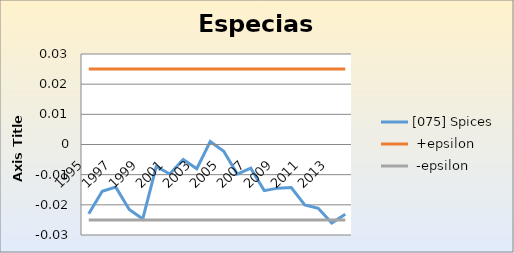
| Category | [075] Spices |  +epsilon |  -epsilon |
|---|---|---|---|
| 1995.0 | -0.023 | 0.025 | -0.025 |
| 1996.0 | -0.015 | 0.025 | -0.025 |
| 1997.0 | -0.014 | 0.025 | -0.025 |
| 1998.0 | -0.022 | 0.025 | -0.025 |
| 1999.0 | -0.025 | 0.025 | -0.025 |
| 2000.0 | -0.007 | 0.025 | -0.025 |
| 2001.0 | -0.01 | 0.025 | -0.025 |
| 2002.0 | -0.005 | 0.025 | -0.025 |
| 2003.0 | -0.008 | 0.025 | -0.025 |
| 2004.0 | 0.001 | 0.025 | -0.025 |
| 2005.0 | -0.002 | 0.025 | -0.025 |
| 2006.0 | -0.01 | 0.025 | -0.025 |
| 2007.0 | -0.008 | 0.025 | -0.025 |
| 2008.0 | -0.015 | 0.025 | -0.025 |
| 2009.0 | -0.014 | 0.025 | -0.025 |
| 2010.0 | -0.014 | 0.025 | -0.025 |
| 2011.0 | -0.02 | 0.025 | -0.025 |
| 2012.0 | -0.021 | 0.025 | -0.025 |
| 2013.0 | -0.026 | 0.025 | -0.025 |
| 2014.0 | -0.023 | 0.025 | -0.025 |